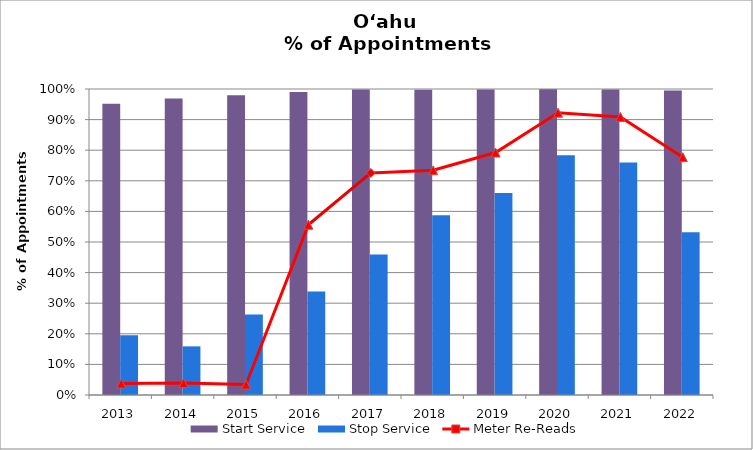
| Category | Start Service | Stop Service |
|---|---|---|
| 2013.0 | 0.952 | 0.196 |
| 2014.0 | 0.969 | 0.159 |
| 2015.0 | 0.979 | 0.263 |
| 2016.0 | 0.99 | 0.338 |
| 2017.0 | 0.999 | 0.459 |
| 2018.0 | 0.997 | 0.588 |
| 2019.0 | 0.998 | 0.66 |
| 2020.0 | 0.999 | 0.783 |
| 2021.0 | 0.998 | 0.76 |
| 2022.0 | 0.995 | 0.532 |